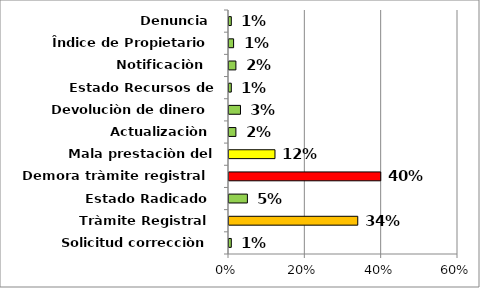
| Category | Series 0 |
|---|---|
| Solicitud correcciòn | 0.006 |
| Tràmite Registral | 0.337 |
| Estado Radicado | 0.048 |
| Demora tràmite registral | 0.398 |
| Mala prestaciòn del servicio | 0.12 |
| Actualizaciòn | 0.018 |
| Devoluciòn de dinero | 0.03 |
| Estado Recursos de apelaciòn | 0.006 |
| Notificaciòn  | 0.018 |
| Îndice de Propietario | 0.012 |
| Denuncia | 0.006 |